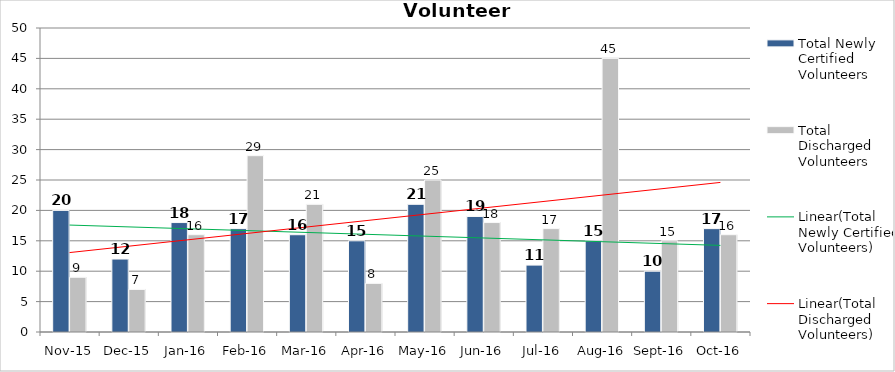
| Category | Total Newly Certified Volunteers | Total Discharged Volunteers |
|---|---|---|
| Nov-15 | 20 | 9 |
| Dec-15 | 12 | 7 |
| Jan-16 | 18 | 16 |
| Feb-16 | 17 | 29 |
| Mar-16 | 16 | 21 |
| Apr-16 | 15 | 8 |
| May-16 | 21 | 25 |
| Jun-16 | 19 | 18 |
| Jul-16 | 11 | 17 |
| Aug-16 | 15 | 45 |
| Sep-16 | 10 | 15 |
| Oct-16 | 17 | 16 |